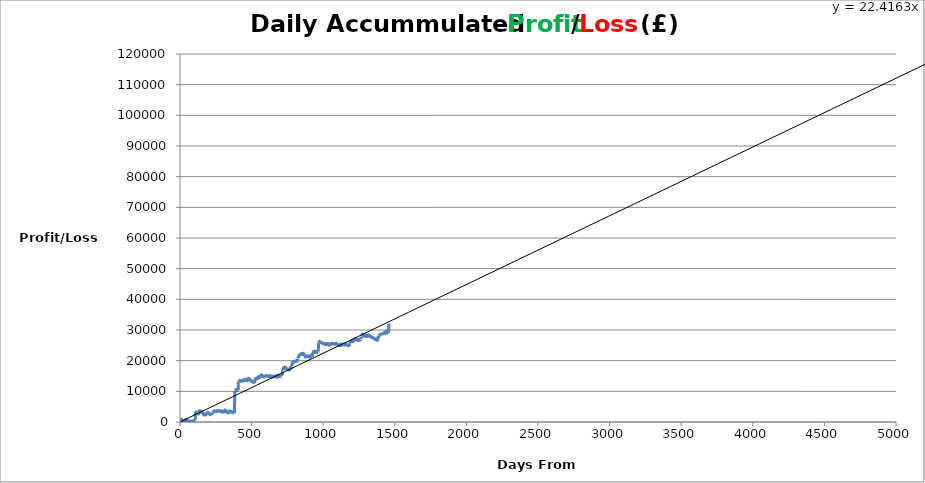
| Category | Accummulated Profit/Loss |
|---|---|
| 1.0 | 79.7 |
| 2.0 | 44 |
| 3.0 | 218.57 |
| 4.0 | 615.34 |
| 5.0 | 641.64 |
| 6.0 | 640.14 |
| 7.0 | 748.59 |
| 8.0 | 823.13 |
| 9.0 | 803.13 |
| 10.0 | 739.13 |
| 11.0 | 869.6 |
| 12.0 | 809.6 |
| 13.0 | 751.6 |
| 14.0 | 751.6 |
| 15.0 | 677.75 |
| 16.0 | 654.25 |
| 17.0 | 574.65 |
| 18.0 | 593.95 |
| 19.0 | 508.95 |
| 20.0 | 441.45 |
| 21.0 | 381.45 |
| 22.0 | 507.23 |
| 23.0 | 426.33 |
| 24.0 | 373.08 |
| 25.0 | 282.06 |
| 26.0 | 180.56 |
| 27.0 | 113.81 |
| 28.0 | 82.89 |
| 29.0 | 473.4 |
| 30.0 | 471.48 |
| 31.0 | 375.08 |
| 32.0 | 453.51 |
| 33.0 | 365.14 |
| 34.0 | 364.51 |
| 35.0 | 306.51 |
| 36.0 | 602.96 |
| 37.0 | 529.11 |
| 38.0 | 439.81 |
| 39.0 | 470.66 |
| 40.0 | 798.36 |
| 41.0 | 817.66 |
| 42.0 | 790.66 |
| 43.0 | 732.66 |
| 44.0 | 703.54 |
| 45.0 | 603.79 |
| 46.0 | 626.46 |
| 47.0 | 710.29 |
| 48.0 | 589.42 |
| 49.0 | 514.1 |
| 50.0 | 597.24 |
| 51.0 | 529.34 |
| 52.0 | 439.47 |
| 53.0 | 454.46 |
| 54.0 | 381.46 |
| 55.0 | 338.28 |
| 56.0 | 298.28 |
| 57.0 | 220.28 |
| 58.0 | 119.06 |
| 59.0 | 559.87 |
| 60.0 | 507.87 |
| 61.0 | 475.35 |
| 62.0 | 436.92 |
| 63.0 | 333.36 |
| 64.0 | 289.36 |
| 65.0 | 245.36 |
| 66.0 | 274.52 |
| 67.0 | 201.52 |
| 68.0 | 240.51 |
| 69.0 | 129.51 |
| 70.0 | 119.51 |
| 71.0 | 119.51 |
| 72.0 | 49.51 |
| 73.0 | 154.59 |
| 74.0 | 128.27 |
| 75.0 | 70.27 |
| 76.0 | -61.23 |
| 77.0 | -36.23 |
| 78.0 | -102.69 |
| 79.0 | 22.27 |
| 80.0 | 112.71 |
| 81.0 | 75.53 |
| 82.0 | 205.55 |
| 83.0 | 219.53 |
| 84.0 | 315.59 |
| 85.0 | 383.97 |
| 86.0 | 383.97 |
| 87.0 | 303.98 |
| 88.0 | 219.38 |
| 89.0 | 169.38 |
| 90.0 | 98.07 |
| 91.0 | 192.07 |
| 92.0 | 156.45 |
| 93.0 | 89.25 |
| 94.0 | -40.72 |
| 95.0 | -92.38 |
| 96.0 | -203.25 |
| 97.0 | -170.45 |
| 98.0 | -167.2 |
| 99.0 | 546.19 |
| 100.0 | 492.39 |
| 101.0 | 539.59 |
| 102.0 | 498.86 |
| 103.0 | 527.36 |
| 104.0 | 576.36 |
| 105.0 | 618.76 |
| 106.0 | 613.45 |
| 107.0 | 3361.83 |
| 108.0 | 3243.48 |
| 109.0 | 3286.38 |
| 110.0 | 3184.88 |
| 111.0 | 3119.58 |
| 112.0 | 3128.21 |
| 113.0 | 3201.34 |
| 114.0 | 3122.84 |
| 115.0 | 3172.71 |
| 116.0 | 3167.71 |
| 117.0 | 3054.2 |
| 118.0 | 2974.2 |
| 119.0 | 2906.8 |
| 120.0 | 2917.7 |
| 121.0 | 2857.7 |
| 122.0 | 2819.9 |
| 123.0 | 2746.4 |
| 124.0 | 2794.06 |
| 125.0 | 2708.65 |
| 126.0 | 2698.65 |
| 127.0 | 2736.67 |
| 128.0 | 2683.67 |
| 129.0 | 2604.29 |
| 130.0 | 2853.79 |
| 131.0 | 2825.79 |
| 132.0 | 2865.54 |
| 133.0 | 2892.6 |
| 134.0 | 3435.61 |
| 135.0 | 3559.16 |
| 136.0 | 3712.52 |
| 137.0 | 3696.77 |
| 138.0 | 3652.04 |
| 139.0 | 3491.04 |
| 140.0 | 3451.04 |
| 141.0 | 3560.04 |
| 142.0 | 3580.79 |
| 143.0 | 3559.72 |
| 144.0 | 3654.22 |
| 145.0 | 3604.37 |
| 146.0 | 3598.87 |
| 147.0 | 3518.87 |
| 148.0 | 3465.51 |
| 149.0 | 3455.51 |
| 150.0 | 3466.51 |
| 151.0 | 3437.16 |
| 152.0 | 3317.88 |
| 153.0 | 3176.88 |
| 154.0 | 3118.88 |
| 155.0 | 3085.43 |
| 156.0 | 2976.53 |
| 157.0 | 2969.47 |
| 158.0 | 2840.69 |
| 159.0 | 2763.3 |
| 160.0 | 2662.93 |
| 161.0 | 2602.93 |
| 162.0 | 2561.83 |
| 163.0 | 2557.67 |
| 164.0 | 2458.23 |
| 165.0 | 2326.73 |
| 166.0 | 2561.98 |
| 167.0 | 2490.98 |
| 168.0 | 2567 |
| 169.0 | 2509.26 |
| 170.0 | 2408.56 |
| 171.0 | 2287.81 |
| 172.0 | 2291.91 |
| 173.0 | 2314.31 |
| 174.0 | 2273.7 |
| 175.0 | 2263.33 |
| 176.0 | 2401.33 |
| 177.0 | 2292.12 |
| 178.0 | 2314.26 |
| 179.0 | 2304.26 |
| 180.0 | 2358.78 |
| 181.0 | 2411.01 |
| 182.0 | 2391.01 |
| 183.0 | 2569.29 |
| 184.0 | 3110.33 |
| 185.0 | 3102.33 |
| 186.0 | 3012.31 |
| 187.0 | 2912.51 |
| 188.0 | 2833.51 |
| 189.0 | 2823.51 |
| 190.0 | 2813.51 |
| 191.0 | 2786.45 |
| 192.0 | 2842.85 |
| 193.0 | 3224.61 |
| 194.0 | 3138.67 |
| 195.0 | 2987.17 |
| 196.0 | 2929.17 |
| 197.0 | 2837.67 |
| 198.0 | 2963.67 |
| 199.0 | 2960.14 |
| 200.0 | 2931.65 |
| 201.0 | 2821.28 |
| 202.0 | 2819.78 |
| 203.0 | 2767.78 |
| 204.0 | 2717.78 |
| 205.0 | 2674.45 |
| 206.0 | 2563.45 |
| 207.0 | 2577.21 |
| 208.0 | 2500.49 |
| 209.0 | 2414.49 |
| 210.0 | 2364.49 |
| 211.0 | 2314.49 |
| 212.0 | 2525.51 |
| 213.0 | 2575.81 |
| 214.0 | 2579.88 |
| 215.0 | 2513.58 |
| 216.0 | 2457.08 |
| 217.0 | 2399.08 |
| 218.0 | 2349.08 |
| 219.0 | 2354.71 |
| 220.0 | 2292.21 |
| 221.0 | 2253.21 |
| 222.0 | 3047.4 |
| 223.0 | 3082.9 |
| 224.0 | 3029.4 |
| 225.0 | 2943.66 |
| 226.0 | 2993.11 |
| 227.0 | 2939.11 |
| 228.0 | 3158.36 |
| 229.0 | 3148.36 |
| 230.0 | 3066.17 |
| 231.0 | 3066.17 |
| 232.0 | 3213.77 |
| 233.0 | 3335.3 |
| 234.0 | 3257.3 |
| 235.0 | 3455.3 |
| 236.0 | 3428.8 |
| 237.0 | 3615.2 |
| 238.0 | 3605.2 |
| 239.0 | 3543.95 |
| 240.0 | 3631.83 |
| 241.0 | 3640.83 |
| 242.0 | 3684.33 |
| 243.0 | 3621.33 |
| 244.0 | 3563.33 |
| 245.0 | 3543.33 |
| 246.0 | 3425.33 |
| 247.0 | 3415.33 |
| 248.0 | 3347.33 |
| 249.0 | 3406.03 |
| 250.0 | 3464.73 |
| 251.0 | 3334.16 |
| 252.0 | 3502.16 |
| 253.0 | 3492.16 |
| 254.0 | 4005.66 |
| 255.0 | 3975.38 |
| 256.0 | 3930.38 |
| 257.0 | 3819.41 |
| 258.0 | 3809.41 |
| 259.0 | 3829.41 |
| 260.0 | 3728.54 |
| 261.0 | 3663.04 |
| 262.0 | 3663.04 |
| 263.0 | 3663.04 |
| 264.0 | 3663.04 |
| 265.0 | 3611.84 |
| 266.0 | 3700.84 |
| 267.0 | 3642.84 |
| 268.0 | 3547.64 |
| 269.0 | 3545.85 |
| 270.0 | 3490.45 |
| 271.0 | 3623.24 |
| 272.0 | 3613.24 |
| 273.0 | 3582.04 |
| 274.0 | 3598.92 |
| 275.0 | 3588.92 |
| 276.0 | 3561.77 |
| 277.0 | 3618.35 |
| 278.0 | 3719.09 |
| 279.0 | 3639.14 |
| 280.0 | 3586.14 |
| 281.0 | 3536.14 |
| 282.0 | 3486.14 |
| 283.0 | 3624.14 |
| 284.0 | 3519.12 |
| 285.0 | 3439.37 |
| 286.0 | 3369.37 |
| 287.0 | 3369.37 |
| 288.0 | 3311.37 |
| 289.0 | 3258.57 |
| 290.0 | 3364.76 |
| 291.0 | 3445.06 |
| 292.0 | 3349.06 |
| 293.0 | 3342.85 |
| 294.0 | 3573.95 |
| 295.0 | 3515.95 |
| 296.0 | 3462.95 |
| 297.0 | 3452.95 |
| 298.0 | 3402.95 |
| 299.0 | 3292.3 |
| 300.0 | 3344.35 |
| 301.0 | 3334.35 |
| 302.0 | 3246.18 |
| 303.0 | 3279.02 |
| 304.0 | 3283.82 |
| 305.0 | 3321.65 |
| 306.0 | 3260.82 |
| 307.0 | 3305.52 |
| 308.0 | 3285.52 |
| 309.0 | 3294.75 |
| 310.0 | 3319 |
| 311.0 | 3619 |
| 312.0 | 3727.6 |
| 313.0 | 3688.6 |
| 314.0 | 3933.48 |
| 315.0 | 3923.48 |
| 316.0 | 3913.48 |
| 317.0 | 3862.92 |
| 318.0 | 3785.67 |
| 319.0 | 3727.67 |
| 320.0 | 3677.67 |
| 321.0 | 3602.29 |
| 322.0 | 3582.29 |
| 323.0 | 3538.29 |
| 324.0 | 3528.29 |
| 325.0 | 3478.29 |
| 326.0 | 3360.84 |
| 327.0 | 3294.29 |
| 328.0 | 3234.29 |
| 329.0 | 3208.29 |
| 330.0 | 3168.29 |
| 331.0 | 3168.29 |
| 332.0 | 3177.14 |
| 333.0 | 3065.64 |
| 334.0 | 3015.64 |
| 335.0 | 3006.74 |
| 336.0 | 3115.74 |
| 337.0 | 3105.74 |
| 338.0 | 3055.74 |
| 339.0 | 3005.74 |
| 340.0 | 3046.94 |
| 341.0 | 3002.94 |
| 342.0 | 3072.94 |
| 343.0 | 3072.94 |
| 344.0 | 3090.71 |
| 345.0 | 3239.78 |
| 346.0 | 3631.71 |
| 347.0 | 3615.73 |
| 348.0 | 3542.63 |
| 349.0 | 3531.07 |
| 350.0 | 3478.27 |
| 351.0 | 3428.27 |
| 352.0 | 3418.27 |
| 353.0 | 3370.27 |
| 354.0 | 3303.5 |
| 355.0 | 3475.18 |
| 356.0 | 3477.56 |
| 357.0 | 3496.16 |
| 358.0 | 3470.16 |
| 359.0 | 3417.76 |
| 360.0 | 3375.91 |
| 361.0 | 3303.94 |
| 362.0 | 3251.34 |
| 363.0 | 3171.49 |
| 364.0 | 3127.49 |
| 365.0 | 3252.89 |
| 366.0 | 3212.89 |
| 367.0 | 3172.89 |
| 368.0 | 3176.89 |
| 369.0 | 3109.08 |
| 370.0 | 3078.58 |
| 371.0 | 3071.11 |
| 372.0 | 3049.11 |
| 373.0 | 3049.11 |
| 374.0 | 2948.11 |
| 375.0 | 3016.85 |
| 376.0 | 2977.85 |
| 377.0 | 2958.14 |
| 378.0 | 2948.14 |
| 379.0 | 3008.94 |
| 380.0 | 2922.66 |
| 381.0 | 2922 |
| 382.0 | 10166.56 |
| 383.0 | 10103.96 |
| 384.0 | 10002.96 |
| 385.0 | 9944.96 |
| 386.0 | 10015.74 |
| 387.0 | 9999.92 |
| 388.0 | 10267.26 |
| 389.0 | 10505.86 |
| 390.0 | 10554.66 |
| 391.0 | 10556.12 |
| 392.0 | 10505.75 |
| 393.0 | 10457.5 |
| 394.0 | 10366.5 |
| 395.0 | 10669 |
| 396.0 | 10601.4 |
| 397.0 | 10520.68 |
| 398.0 | 10364.45 |
| 399.0 | 10364.45 |
| 400.0 | 10280.73 |
| 401.0 | 10276.73 |
| 402.0 | 10397.48 |
| 403.0 | 10642.62 |
| 404.0 | 10541.62 |
| 405.0 | 10442.18 |
| 406.0 | 10432.18 |
| 407.0 | 12315.01 |
| 408.0 | 13232.01 |
| 409.0 | 13342.01 |
| 410.0 | 13355.71 |
| 411.0 | 13368.32 |
| 412.0 | 13481.2 |
| 413.0 | 13471.2 |
| 414.0 | 13504.3 |
| 415.0 | 13481.9 |
| 416.0 | 13431.9 |
| 417.0 | 13431.9 |
| 418.0 | 13570.7 |
| 419.0 | 13479.75 |
| 420.0 | 13520.21 |
| 421.0 | 13516.51 |
| 422.0 | 13426.76 |
| 423.0 | 13448.14 |
| 424.0 | 13347.17 |
| 425.0 | 13340.67 |
| 426.0 | 13326.42 |
| 427.0 | 13316.42 |
| 428.0 | 13307.47 |
| 429.0 | 13239.47 |
| 430.0 | 13367.47 |
| 431.0 | 13479.87 |
| 432.0 | 13511.61 |
| 433.0 | 13518.41 |
| 434.0 | 13518.41 |
| 435.0 | 13463.51 |
| 436.0 | 13353.61 |
| 437.0 | 13306.66 |
| 438.0 | 13431.56 |
| 439.0 | 13364.97 |
| 440.0 | 13441.37 |
| 441.0 | 13592.27 |
| 442.0 | 13651.37 |
| 443.0 | 13658.12 |
| 444.0 | 13718.8 |
| 445.0 | 13682.6 |
| 446.0 | 13692.96 |
| 447.0 | 13622.11 |
| 448.0 | 13566.61 |
| 449.0 | 13457.56 |
| 450.0 | 13457.8 |
| 451.0 | 13853.64 |
| 452.0 | 13947.87 |
| 453.0 | 13885.55 |
| 454.0 | 13765.79 |
| 455.0 | 13845.79 |
| 456.0 | 13787.79 |
| 457.0 | 13874.21 |
| 458.0 | 13813.78 |
| 459.0 | 13763.78 |
| 460.0 | 13817.43 |
| 461.0 | 13772.04 |
| 462.0 | 13721.6 |
| 463.0 | 13651.6 |
| 464.0 | 13593.14 |
| 465.0 | 13523.14 |
| 466.0 | 13436.5 |
| 467.0 | 13497.68 |
| 468.0 | 13424.04 |
| 469.0 | 13488.54 |
| 470.0 | 13590.64 |
| 471.0 | 13534.24 |
| 472.0 | 13544.44 |
| 473.0 | 13720.08 |
| 474.0 | 13693.34 |
| 475.0 | 14029.74 |
| 476.0 | 14096.56 |
| 477.0 | 14212.11 |
| 478.0 | 14142.49 |
| 479.0 | 14248.53 |
| 480.0 | 14242.8 |
| 481.0 | 14285.2 |
| 482.0 | 14173.7 |
| 483.0 | 14123.7 |
| 484.0 | 14002.2 |
| 485.0 | 13921.2 |
| 486.0 | 13790.75 |
| 487.0 | 13736.75 |
| 488.0 | 13756.15 |
| 489.0 | 13660.15 |
| 490.0 | 13628.15 |
| 491.0 | 13726.15 |
| 492.0 | 13676.15 |
| 493.0 | 13574.65 |
| 494.0 | 13487.15 |
| 495.0 | 13434.61 |
| 496.0 | 13366.91 |
| 497.0 | 13315.26 |
| 498.0 | 13305.26 |
| 499.0 | 13357.01 |
| 500.0 | 13275.85 |
| 501.0 | 13411.85 |
| 502.0 | 13409.76 |
| 503.0 | 13288.78 |
| 504.0 | 13228.78 |
| 505.0 | 13138.91 |
| 506.0 | 13107.02 |
| 507.0 | 13081.02 |
| 508.0 | 13037.02 |
| 509.0 | 12906.02 |
| 510.0 | 13041.94 |
| 511.0 | 13003.26 |
| 512.0 | 13182.85 |
| 513.0 | 13129.35 |
| 514.0 | 13015.7 |
| 515.0 | 12945.7 |
| 516.0 | 12975.7 |
| 517.0 | 12957.1 |
| 518.0 | 12897.1 |
| 519.0 | 13122.68 |
| 520.0 | 13072.68 |
| 521.0 | 13173.46 |
| 522.0 | 13197.6 |
| 523.0 | 13196.03 |
| 524.0 | 13234.6 |
| 525.0 | 13792.74 |
| 526.0 | 14051.93 |
| 527.0 | 14099.73 |
| 528.0 | 14155.13 |
| 529.0 | 14156.83 |
| 530.0 | 14126.33 |
| 531.0 | 14225.44 |
| 532.0 | 14194.94 |
| 533.0 | 14148.46 |
| 534.0 | 14071.69 |
| 535.0 | 14226.79 |
| 536.0 | 14165.29 |
| 537.0 | 14064.32 |
| 538.0 | 14145.52 |
| 539.0 | 14226.64 |
| 540.0 | 14263.53 |
| 541.0 | 14236.28 |
| 542.0 | 14269.7 |
| 543.0 | 14176.24 |
| 544.0 | 14284.35 |
| 545.0 | 14718.86 |
| 546.0 | 14653.86 |
| 547.0 | 14578.86 |
| 548.0 | 14532.11 |
| 549.0 | 14462.11 |
| 550.0 | 14529.36 |
| 551.0 | 14606.55 |
| 552.0 | 14470.2 |
| 553.0 | 14420.2 |
| 554.0 | 14686.52 |
| 555.0 | 14811.55 |
| 556.0 | 14843.6 |
| 557.0 | 14750.6 |
| 558.0 | 14797.85 |
| 559.0 | 14947.85 |
| 560.0 | 14947.85 |
| 561.0 | 14879.98 |
| 562.0 | 15115.98 |
| 563.0 | 15153.26 |
| 564.0 | 15250.14 |
| 565.0 | 15154.19 |
| 566.0 | 15385.44 |
| 567.0 | 15370.44 |
| 568.0 | 15320.44 |
| 569.0 | 15392.74 |
| 570.0 | 15342.5 |
| 571.0 | 15212.5 |
| 572.0 | 15164.41 |
| 573.0 | 15111.66 |
| 574.0 | 15061.66 |
| 575.0 | 15035.66 |
| 576.0 | 15035.66 |
| 577.0 | 15035.66 |
| 578.0 | 15035.66 |
| 579.0 | 14969.41 |
| 580.0 | 14879.41 |
| 581.0 | 14829.81 |
| 582.0 | 14860.21 |
| 583.0 | 14850.21 |
| 584.0 | 14770.21 |
| 585.0 | 14716.41 |
| 586.0 | 14927.23 |
| 587.0 | 14784.57 |
| 588.0 | 14706.57 |
| 589.0 | 14638.7 |
| 590.0 | 14686.02 |
| 591.0 | 14622.52 |
| 592.0 | 14636.02 |
| 593.0 | 15275.05 |
| 594.0 | 15223.35 |
| 595.0 | 15222.85 |
| 596.0 | 15164.85 |
| 597.0 | 15164.85 |
| 598.0 | 15094.85 |
| 599.0 | 15044.85 |
| 600.0 | 15044.08 |
| 601.0 | 14991.08 |
| 602.0 | 14991.08 |
| 603.0 | 15071.08 |
| 604.0 | 15021.08 |
| 605.0 | 14962.08 |
| 606.0 | 14977.08 |
| 607.0 | 14933.08 |
| 608.0 | 15076.07 |
| 609.0 | 15066.07 |
| 610.0 | 15057.78 |
| 611.0 | 15007.78 |
| 612.0 | 15141.8 |
| 613.0 | 15061.8 |
| 614.0 | 15075.24 |
| 615.0 | 15016.69 |
| 616.0 | 15016.69 |
| 617.0 | 14956.69 |
| 618.0 | 14898.69 |
| 619.0 | 14915.99 |
| 620.0 | 14830.99 |
| 621.0 | 14936.05 |
| 622.0 | 14948.88 |
| 623.0 | 14988.48 |
| 624.0 | 14886.98 |
| 625.0 | 14836.98 |
| 626.0 | 14926.68 |
| 627.0 | 14846.93 |
| 628.0 | 14846.93 |
| 629.0 | 14846.93 |
| 630.0 | 14846.93 |
| 631.0 | 14826.43 |
| 632.0 | 15031.83 |
| 633.0 | 15005.83 |
| 634.0 | 15110.83 |
| 635.0 | 15010.18 |
| 636.0 | 14929.18 |
| 637.0 | 14986.15 |
| 638.0 | 14928.75 |
| 639.0 | 14868.75 |
| 640.0 | 14728.13 |
| 641.0 | 14919.88 |
| 642.0 | 14859.61 |
| 643.0 | 14826.24 |
| 644.0 | 14776.24 |
| 645.0 | 14706.24 |
| 646.0 | 14691.19 |
| 647.0 | 14705.19 |
| 648.0 | 14677.19 |
| 649.0 | 14780.63 |
| 650.0 | 14751.02 |
| 651.0 | 14751.02 |
| 652.0 | 14831.02 |
| 653.0 | 14730 |
| 654.0 | 14933.07 |
| 655.0 | 14992.44 |
| 656.0 | 14973.65 |
| 657.0 | 14883.65 |
| 658.0 | 14883.65 |
| 659.0 | 14933.65 |
| 660.0 | 14883.65 |
| 661.0 | 14835.65 |
| 662.0 | 14764.65 |
| 663.0 | 14748.47 |
| 664.0 | 14737.47 |
| 665.0 | 14834.32 |
| 666.0 | 14790.32 |
| 667.0 | 14712.32 |
| 668.0 | 14776.3 |
| 669.0 | 14965.1 |
| 670.0 | 14892.4 |
| 671.0 | 15032.94 |
| 672.0 | 14964.94 |
| 673.0 | 14873.93 |
| 674.0 | 14796.19 |
| 675.0 | 14725.39 |
| 676.0 | 14769.39 |
| 677.0 | 14749.39 |
| 678.0 | 14617.89 |
| 679.0 | 14567.89 |
| 680.0 | 14793.69 |
| 681.0 | 14735.69 |
| 682.0 | 14667.69 |
| 683.0 | 14834.99 |
| 684.0 | 14781.92 |
| 685.0 | 15248.92 |
| 686.0 | 15208.92 |
| 687.0 | 15158.92 |
| 688.0 | 15108.92 |
| 689.0 | 15018.05 |
| 690.0 | 14964.05 |
| 691.0 | 14954.68 |
| 692.0 | 14856.87 |
| 693.0 | 14834.47 |
| 694.0 | 15002.47 |
| 695.0 | 14952.47 |
| 696.0 | 14961.57 |
| 697.0 | 14916.57 |
| 698.0 | 14961.77 |
| 699.0 | 14911.77 |
| 700.0 | 14861.77 |
| 701.0 | 14853.45 |
| 702.0 | 14910.99 |
| 703.0 | 14907.68 |
| 704.0 | 15256.83 |
| 705.0 | 15198.83 |
| 706.0 | 15108.83 |
| 707.0 | 15108.83 |
| 708.0 | 15050.14 |
| 709.0 | 15545.99 |
| 710.0 | 15590.59 |
| 711.0 | 15603.59 |
| 712.0 | 15536.09 |
| 713.0 | 15544.32 |
| 714.0 | 15490.32 |
| 715.0 | 15829.42 |
| 716.0 | 16557.57 |
| 717.0 | 16797.69 |
| 718.0 | 16902.49 |
| 719.0 | 16900.49 |
| 720.0 | 16903.59 |
| 721.0 | 16893.59 |
| 722.0 | 16853.59 |
| 723.0 | 18189.47 |
| 724.0 | 18162.17 |
| 725.0 | 18127.17 |
| 726.0 | 18125.42 |
| 727.0 | 17983.92 |
| 728.0 | 17973.92 |
| 729.0 | 17963.92 |
| 730.0 | 17963.92 |
| 731.0 | 17865.77 |
| 732.0 | 17838.48 |
| 733.0 | 17861.73 |
| 734.0 | 17832.53 |
| 735.0 | 17782.53 |
| 736.0 | 17707.83 |
| 737.0 | 17767.39 |
| 738.0 | 17693.64 |
| 739.0 | 17643.64 |
| 740.0 | 17580.64 |
| 741.0 | 17500.94 |
| 742.0 | 17500.94 |
| 743.0 | 17449.44 |
| 744.0 | 17358.44 |
| 745.0 | 17338.76 |
| 746.0 | 17373.76 |
| 747.0 | 17332.58 |
| 748.0 | 17181.08 |
| 749.0 | 17181.08 |
| 750.0 | 17117.08 |
| 751.0 | 17259.28 |
| 752.0 | 17251.08 |
| 753.0 | 17231.08 |
| 754.0 | 17173.83 |
| 755.0 | 17098.03 |
| 756.0 | 17040.03 |
| 757.0 | 16962.41 |
| 758.0 | 16939.34 |
| 759.0 | 16935.08 |
| 760.0 | 16988.4 |
| 761.0 | 16898.6 |
| 762.0 | 16906.48 |
| 763.0 | 17060.11 |
| 764.0 | 17206.79 |
| 765.0 | 17154.79 |
| 766.0 | 17146.04 |
| 767.0 | 17141.04 |
| 768.0 | 17100.04 |
| 769.0 | 17474.16 |
| 770.0 | 17434.16 |
| 771.0 | 17434.16 |
| 772.0 | 17366.56 |
| 773.0 | 17266.56 |
| 774.0 | 17568.57 |
| 775.0 | 17492.57 |
| 776.0 | 18153.47 |
| 777.0 | 18095.47 |
| 778.0 | 18127.21 |
| 779.0 | 17998.46 |
| 780.0 | 18024.84 |
| 781.0 | 18363.52 |
| 782.0 | 18353.52 |
| 783.0 | 18288.9 |
| 784.0 | 19441.4 |
| 785.0 | 19629.94 |
| 786.0 | 19674.63 |
| 787.0 | 19573.63 |
| 788.0 | 19526.83 |
| 789.0 | 19629.59 |
| 790.0 | 19555.44 |
| 791.0 | 19555.44 |
| 792.0 | 19454.44 |
| 793.0 | 19400.44 |
| 794.0 | 19572.94 |
| 795.0 | 19497.94 |
| 796.0 | 19604.48 |
| 797.0 | 19615.11 |
| 798.0 | 19562.31 |
| 799.0 | 19512.31 |
| 800.0 | 19720.23 |
| 801.0 | 19830.73 |
| 802.0 | 19772.73 |
| 803.0 | 19794.7 |
| 804.0 | 19825.4 |
| 805.0 | 19815.4 |
| 806.0 | 19855.4 |
| 807.0 | 19799.35 |
| 808.0 | 19760.58 |
| 809.0 | 19776.58 |
| 810.0 | 19842.14 |
| 811.0 | 19794.44 |
| 812.0 | 19889.74 |
| 813.0 | 19967.34 |
| 814.0 | 19951.35 |
| 815.0 | 19860.35 |
| 816.0 | 19721.79 |
| 817.0 | 19677.39 |
| 818.0 | 19710.19 |
| 819.0 | 20569.87 |
| 820.0 | 20613.53 |
| 821.0 | 20512.53 |
| 822.0 | 20595.97 |
| 823.0 | 20492.58 |
| 824.0 | 20725.55 |
| 825.0 | 20839.83 |
| 826.0 | 20762.08 |
| 827.0 | 21244.18 |
| 828.0 | 21460.21 |
| 829.0 | 21392.41 |
| 830.0 | 21282.54 |
| 831.0 | 21220.45 |
| 832.0 | 21716.41 |
| 833.0 | 21649.41 |
| 834.0 | 21860.94 |
| 835.0 | 21863.44 |
| 836.0 | 21890.07 |
| 837.0 | 21810.07 |
| 838.0 | 22000.14 |
| 839.0 | 22031.32 |
| 840.0 | 21981.32 |
| 841.0 | 21960.65 |
| 842.0 | 22133.65 |
| 843.0 | 22089.65 |
| 844.0 | 22191.12 |
| 845.0 | 22233.92 |
| 846.0 | 22280.92 |
| 847.0 | 22240.92 |
| 848.0 | 22129.95 |
| 849.0 | 22121.95 |
| 850.0 | 22119.72 |
| 851.0 | 22175.14 |
| 852.0 | 22058.64 |
| 853.0 | 22041.49 |
| 854.0 | 22031.49 |
| 855.0 | 21987.07 |
| 856.0 | 22255.83 |
| 857.0 | 22181.83 |
| 858.0 | 22296.95 |
| 859.0 | 22415.46 |
| 860.0 | 22379.67 |
| 861.0 | 22369.67 |
| 862.0 | 22292.27 |
| 863.0 | 22250.77 |
| 864.0 | 22247.52 |
| 865.0 | 22144.72 |
| 866.0 | 22025.92 |
| 867.0 | 21889.42 |
| 868.0 | 21831.42 |
| 869.0 | 21757.15 |
| 870.0 | 21671.05 |
| 871.0 | 21603.3 |
| 872.0 | 21506.8 |
| 873.0 | 21396.05 |
| 874.0 | 21269.3 |
| 875.0 | 21229.3 |
| 876.0 | 21315.86 |
| 877.0 | 21304.3 |
| 878.0 | 21332.93 |
| 879.0 | 21241.93 |
| 880.0 | 21414.93 |
| 881.0 | 21373.18 |
| 882.0 | 21410.5 |
| 883.0 | 21452.69 |
| 884.0 | 21402.69 |
| 885.0 | 21352.69 |
| 886.0 | 21379.29 |
| 887.0 | 21444.93 |
| 888.0 | 21604.49 |
| 889.0 | 21534.49 |
| 890.0 | 21482.49 |
| 891.0 | 21502.74 |
| 892.0 | 21473.84 |
| 893.0 | 21434.84 |
| 894.0 | 21469.07 |
| 895.0 | 21379.2 |
| 896.0 | 21412.64 |
| 897.0 | 21354.64 |
| 898.0 | 21265.39 |
| 899.0 | 21184.39 |
| 900.0 | 21399.99 |
| 901.0 | 21393.59 |
| 902.0 | 21285.1 |
| 903.0 | 21341.1 |
| 904.0 | 21297.35 |
| 905.0 | 21283.68 |
| 906.0 | 21306.32 |
| 907.0 | 21373.56 |
| 908.0 | 21284.74 |
| 909.0 | 21128.24 |
| 910.0 | 21262.08 |
| 911.0 | 21331.14 |
| 912.0 | 21675.64 |
| 913.0 | 21658.53 |
| 914.0 | 21683.83 |
| 915.0 | 21691.08 |
| 916.0 | 21798.38 |
| 917.0 | 21718.33 |
| 918.0 | 21597.36 |
| 919.0 | 21508.05 |
| 920.0 | 21536.55 |
| 921.0 | 21563.28 |
| 922.0 | 21691.78 |
| 923.0 | 21696.93 |
| 924.0 | 21644.76 |
| 925.0 | 21632.89 |
| 926.0 | 22111.09 |
| 927.0 | 22242.09 |
| 928.0 | 22473.19 |
| 929.0 | 22414.39 |
| 930.0 | 22862.46 |
| 931.0 | 22829.06 |
| 932.0 | 23317.31 |
| 933.0 | 23252.61 |
| 934.0 | 23185.41 |
| 935.0 | 23226.23 |
| 936.0 | 23184.49 |
| 937.0 | 23077.99 |
| 938.0 | 23017.99 |
| 939.0 | 23068.07 |
| 940.0 | 22969.62 |
| 941.0 | 22946.12 |
| 942.0 | 22940.02 |
| 943.0 | 22874.46 |
| 944.0 | 22773.46 |
| 945.0 | 22763.46 |
| 946.0 | 22982.6 |
| 947.0 | 22932.6 |
| 948.0 | 23049.29 |
| 949.0 | 23056.09 |
| 950.0 | 22998.42 |
| 951.0 | 22900.09 |
| 952.0 | 22850.09 |
| 953.0 | 22890.49 |
| 954.0 | 22859.29 |
| 955.0 | 22775.23 |
| 956.0 | 22769.11 |
| 957.0 | 22665.66 |
| 958.0 | 22824.77 |
| 959.0 | 22784.63 |
| 960.0 | 22839.83 |
| 961.0 | 22787.83 |
| 962.0 | 22797.83 |
| 963.0 | 22811.96 |
| 964.0 | 23076.9 |
| 965.0 | 22976.22 |
| 966.0 | 22976.22 |
| 967.0 | 25687.02 |
| 968.0 | 25777.57 |
| 969.0 | 25920.72 |
| 970.0 | 26044.88 |
| 971.0 | 26142.48 |
| 972.0 | 26074.48 |
| 973.0 | 26064.48 |
| 974.0 | 26323.33 |
| 975.0 | 26255.33 |
| 976.0 | 26195.71 |
| 977.0 | 26155.71 |
| 978.0 | 26101.51 |
| 979.0 | 25981.42 |
| 980.0 | 25981.42 |
| 981.0 | 26001.42 |
| 982.0 | 25950.76 |
| 983.0 | 25890.76 |
| 984.0 | 26012.76 |
| 985.0 | 25967.76 |
| 986.0 | 25948.39 |
| 987.0 | 25958.79 |
| 988.0 | 25898.79 |
| 989.0 | 25880.79 |
| 990.0 | 25876.87 |
| 991.0 | 25852.49 |
| 992.0 | 25761.49 |
| 993.0 | 25713.62 |
| 994.0 | 25713.62 |
| 995.0 | 25713.62 |
| 996.0 | 25635.16 |
| 997.0 | 25567.29 |
| 998.0 | 25534.49 |
| 999.0 | 25534.49 |
| 1000.0 | 25665.66 |
| 1001.0 | 25713.81 |
| 1002.0 | 25636.79 |
| 1003.0 | 25578.79 |
| 1004.0 | 25492.94 |
| 1005.0 | 25461.64 |
| 1006.0 | 25431.84 |
| 1007.0 | 25520.14 |
| 1008.0 | 25460.14 |
| 1009.0 | 25532.94 |
| 1010.0 | 25472.94 |
| 1011.0 | 25404.93 |
| 1012.0 | 25346.93 |
| 1013.0 | 25381.89 |
| 1014.0 | 25356.44 |
| 1015.0 | 25296.44 |
| 1016.0 | 25426.28 |
| 1017.0 | 25368.28 |
| 1018.0 | 25298.28 |
| 1019.0 | 25324.82 |
| 1020.0 | 25231.58 |
| 1021.0 | 25181.58 |
| 1022.0 | 25225.14 |
| 1023.0 | 25561.91 |
| 1024.0 | 25611.91 |
| 1025.0 | 25680.86 |
| 1026.0 | 25633.88 |
| 1027.0 | 25640.28 |
| 1028.0 | 25572.28 |
| 1029.0 | 25572.28 |
| 1030.0 | 25518.28 |
| 1031.0 | 25448.28 |
| 1032.0 | 25370.68 |
| 1033.0 | 25334.28 |
| 1034.0 | 25315.96 |
| 1035.0 | 25238.31 |
| 1036.0 | 25228.31 |
| 1037.0 | 25178.31 |
| 1038.0 | 25143.51 |
| 1039.0 | 25090.39 |
| 1040.0 | 25524.03 |
| 1041.0 | 25534.03 |
| 1042.0 | 25449.41 |
| 1043.0 | 25439.41 |
| 1044.0 | 25375.61 |
| 1045.0 | 25365.61 |
| 1046.0 | 25395.96 |
| 1047.0 | 25399.21 |
| 1048.0 | 25392.61 |
| 1049.0 | 25302.8 |
| 1050.0 | 25249.8 |
| 1051.0 | 25244.78 |
| 1052.0 | 25228.76 |
| 1053.0 | 25419.31 |
| 1054.0 | 25387.77 |
| 1055.0 | 25333.77 |
| 1056.0 | 25439.46 |
| 1057.0 | 25628.75 |
| 1058.0 | 25567.35 |
| 1059.0 | 25672.65 |
| 1060.0 | 25672.65 |
| 1061.0 | 25672.65 |
| 1062.0 | 25672.65 |
| 1063.0 | 25691.15 |
| 1064.0 | 25641.15 |
| 1065.0 | 25623.05 |
| 1066.0 | 25559.25 |
| 1067.0 | 25556.6 |
| 1068.0 | 25496.6 |
| 1069.0 | 25535.53 |
| 1070.0 | 25619.6 |
| 1071.0 | 25619.6 |
| 1072.0 | 25619.6 |
| 1073.0 | 25523.29 |
| 1074.0 | 25509.27 |
| 1075.0 | 25526.52 |
| 1076.0 | 25408.02 |
| 1077.0 | 25322.77 |
| 1078.0 | 25322.77 |
| 1079.0 | 25428.77 |
| 1080.0 | 25378.77 |
| 1081.0 | 25317.52 |
| 1082.0 | 25363.58 |
| 1083.0 | 25481.21 |
| 1084.0 | 25435.21 |
| 1085.0 | 25519.6 |
| 1086.0 | 25578.85 |
| 1087.0 | 25520.85 |
| 1088.0 | 25440.75 |
| 1089.0 | 25465.54 |
| 1090.0 | 25674.54 |
| 1091.0 | 25606.54 |
| 1092.0 | 25573.53 |
| 1093.0 | 25547.53 |
| 1094.0 | 25469.91 |
| 1095.0 | 25473.91 |
| 1096.0 | 25423.91 |
| 1097.0 | 25413.91 |
| 1098.0 | 25302.41 |
| 1099.0 | 25309.45 |
| 1100.0 | 25239.19 |
| 1101.0 | 25177.69 |
| 1102.0 | 25099.69 |
| 1103.0 | 25051.19 |
| 1104.0 | 24940.19 |
| 1105.0 | 25199.73 |
| 1106.0 | 25243.23 |
| 1107.0 | 25233.23 |
| 1108.0 | 25224.03 |
| 1109.0 | 25123.38 |
| 1110.0 | 25092.88 |
| 1111.0 | 24981.88 |
| 1112.0 | 25086.88 |
| 1113.0 | 25036.88 |
| 1114.0 | 25017.88 |
| 1115.0 | 24958.08 |
| 1116.0 | 25187.68 |
| 1117.0 | 25056.18 |
| 1118.0 | 24976.37 |
| 1119.0 | 25214.87 |
| 1120.0 | 25204.87 |
| 1121.0 | 25340.26 |
| 1122.0 | 25243.39 |
| 1123.0 | 25183.39 |
| 1124.0 | 25265.08 |
| 1125.0 | 25154.28 |
| 1126.0 | 25027.78 |
| 1127.0 | 24949.78 |
| 1128.0 | 25051.03 |
| 1129.0 | 24987.03 |
| 1130.0 | 25103.06 |
| 1131.0 | 25241.44 |
| 1132.0 | 25445.64 |
| 1133.0 | 25373.16 |
| 1134.0 | 25408.74 |
| 1135.0 | 25375.77 |
| 1136.0 | 25322.52 |
| 1137.0 | 25371.02 |
| 1138.0 | 25443.97 |
| 1139.0 | 25358.87 |
| 1140.0 | 25458.67 |
| 1141.0 | 25438.67 |
| 1142.0 | 25388.67 |
| 1143.0 | 25344.67 |
| 1144.0 | 25288.25 |
| 1145.0 | 25266.25 |
| 1146.0 | 25170.25 |
| 1147.0 | 25119.58 |
| 1148.0 | 25063.51 |
| 1149.0 | 25167.26 |
| 1150.0 | 25486.95 |
| 1151.0 | 25526.95 |
| 1152.0 | 25505.35 |
| 1153.0 | 25484.35 |
| 1154.0 | 25439.35 |
| 1155.0 | 25383.05 |
| 1156.0 | 25465.45 |
| 1157.0 | 25415.45 |
| 1158.0 | 25296.49 |
| 1159.0 | 25239.49 |
| 1160.0 | 25397.31 |
| 1161.0 | 25343.31 |
| 1162.0 | 25333.31 |
| 1163.0 | 25293.31 |
| 1164.0 | 25253.31 |
| 1165.0 | 25284.42 |
| 1166.0 | 25234.42 |
| 1167.0 | 25224.42 |
| 1168.0 | 25161.85 |
| 1169.0 | 25151.85 |
| 1170.0 | 25089.81 |
| 1171.0 | 24951.06 |
| 1172.0 | 24907.26 |
| 1173.0 | 25007.89 |
| 1174.0 | 24949.89 |
| 1175.0 | 24979.31 |
| 1176.0 | 24967.91 |
| 1177.0 | 25002.17 |
| 1178.0 | 24952.17 |
| 1179.0 | 24976.43 |
| 1180.0 | 24886.68 |
| 1181.0 | 24977.16 |
| 1182.0 | 25566.2 |
| 1183.0 | 25498.2 |
| 1184.0 | 25436 |
| 1185.0 | 25604 |
| 1186.0 | 25655.1 |
| 1187.0 | 25655.1 |
| 1188.0 | 25683.2 |
| 1189.0 | 25641.25 |
| 1190.0 | 26309.5 |
| 1191.0 | 26207 |
| 1192.0 | 26120.94 |
| 1193.0 | 26122.1 |
| 1194.0 | 26122.1 |
| 1195.0 | 26118.35 |
| 1196.0 | 26718.3 |
| 1197.0 | 26747.1 |
| 1198.0 | 26716.49 |
| 1199.0 | 26640.6 |
| 1200.0 | 26563.52 |
| 1201.0 | 26510.77 |
| 1202.0 | 26457.11 |
| 1203.0 | 26426.15 |
| 1204.0 | 26562.95 |
| 1205.0 | 26473.05 |
| 1206.0 | 26351.55 |
| 1207.0 | 26281.55 |
| 1208.0 | 26183.41 |
| 1209.0 | 26166.37 |
| 1210.0 | 26511.75 |
| 1211.0 | 26461.75 |
| 1212.0 | 26440.75 |
| 1213.0 | 26502.06 |
| 1214.0 | 26544.19 |
| 1215.0 | 26708.2 |
| 1216.0 | 26770.38 |
| 1217.0 | 26968.48 |
| 1218.0 | 26989.94 |
| 1219.0 | 27099.94 |
| 1220.0 | 27095.74 |
| 1221.0 | 27130.31 |
| 1222.0 | 27112.71 |
| 1223.0 | 27086.91 |
| 1224.0 | 26995.91 |
| 1225.0 | 26985.91 |
| 1226.0 | 27023.91 |
| 1227.0 | 27026.16 |
| 1228.0 | 26884.66 |
| 1229.0 | 26948.16 |
| 1230.0 | 26885.56 |
| 1231.0 | 26816.31 |
| 1232.0 | 27013.91 |
| 1233.0 | 26901.45 |
| 1234.0 | 26834.45 |
| 1235.0 | 26761.03 |
| 1236.0 | 26760.96 |
| 1237.0 | 26641.4 |
| 1238.0 | 26582.75 |
| 1239.0 | 26711.39 |
| 1240.0 | 26661.39 |
| 1241.0 | 26628.59 |
| 1242.0 | 26655.45 |
| 1243.0 | 26866.45 |
| 1244.0 | 26900.2 |
| 1245.0 | 26909.27 |
| 1246.0 | 26859.27 |
| 1247.0 | 26783.35 |
| 1248.0 | 26723.35 |
| 1249.0 | 26632.35 |
| 1250.0 | 26605.89 |
| 1251.0 | 26583.49 |
| 1252.0 | 26644.97 |
| 1253.0 | 26991.37 |
| 1254.0 | 26940.21 |
| 1255.0 | 26860.26 |
| 1256.0 | 26810.26 |
| 1257.0 | 26917.81 |
| 1258.0 | 26877.81 |
| 1259.0 | 26802.91 |
| 1260.0 | 26792.91 |
| 1261.0 | 26892.21 |
| 1262.0 | 26901.84 |
| 1263.0 | 26951.32 |
| 1264.0 | 27177.32 |
| 1265.0 | 27336.07 |
| 1266.0 | 27268 |
| 1267.0 | 27746.92 |
| 1268.0 | 27704.62 |
| 1269.0 | 27954.22 |
| 1270.0 | 28124.04 |
| 1271.0 | 28063.79 |
| 1272.0 | 28094.79 |
| 1273.0 | 28581.62 |
| 1274.0 | 28563.54 |
| 1275.0 | 28473.79 |
| 1276.0 | 28384.99 |
| 1277.0 | 28446.13 |
| 1278.0 | 28420.13 |
| 1279.0 | 28399.03 |
| 1280.0 | 28313.58 |
| 1281.0 | 28269.2 |
| 1282.0 | 28328.2 |
| 1283.0 | 28227.25 |
| 1284.0 | 28240.5 |
| 1285.0 | 28184.13 |
| 1286.0 | 28200.34 |
| 1287.0 | 28167.54 |
| 1288.0 | 28132.54 |
| 1289.0 | 28149.61 |
| 1290.0 | 28071.61 |
| 1291.0 | 27990.61 |
| 1292.0 | 27880.68 |
| 1293.0 | 27895.1 |
| 1294.0 | 27864.79 |
| 1295.0 | 27854.79 |
| 1296.0 | 27785.79 |
| 1297.0 | 27925.63 |
| 1298.0 | 28379.27 |
| 1299.0 | 28316.27 |
| 1300.0 | 28279.12 |
| 1301.0 | 28185.44 |
| 1302.0 | 28165.44 |
| 1303.0 | 28187.94 |
| 1304.0 | 28125.94 |
| 1305.0 | 28057.94 |
| 1306.0 | 28037.16 |
| 1307.0 | 28047.91 |
| 1308.0 | 27957.07 |
| 1309.0 | 27957.07 |
| 1310.0 | 27917.07 |
| 1311.0 | 28131.36 |
| 1312.0 | 28271.8 |
| 1313.0 | 28320.12 |
| 1314.0 | 28244.34 |
| 1315.0 | 28315.58 |
| 1316.0 | 28315.58 |
| 1317.0 | 28265.58 |
| 1318.0 | 28382.39 |
| 1319.0 | 28302.54 |
| 1320.0 | 28272.14 |
| 1321.0 | 28171.39 |
| 1322.0 | 28247.79 |
| 1323.0 | 28167.79 |
| 1324.0 | 28220.29 |
| 1325.0 | 28210.29 |
| 1326.0 | 28118.99 |
| 1327.0 | 28044.09 |
| 1328.0 | 27934.72 |
| 1329.0 | 27865.32 |
| 1330.0 | 27815.32 |
| 1331.0 | 27757.32 |
| 1332.0 | 27717.32 |
| 1333.0 | 27714.26 |
| 1334.0 | 27782.86 |
| 1335.0 | 27798.06 |
| 1336.0 | 27727.52 |
| 1337.0 | 27667.52 |
| 1338.0 | 27640.52 |
| 1339.0 | 27600.52 |
| 1340.0 | 27668.3 |
| 1341.0 | 27658.3 |
| 1342.0 | 27556.8 |
| 1343.0 | 27479.29 |
| 1344.0 | 27481.85 |
| 1345.0 | 27471.85 |
| 1346.0 | 27410.85 |
| 1347.0 | 27579.75 |
| 1348.0 | 27479.17 |
| 1349.0 | 27511.63 |
| 1350.0 | 27421.88 |
| 1351.0 | 27421.88 |
| 1352.0 | 27360.76 |
| 1353.0 | 27350.76 |
| 1354.0 | 27209.26 |
| 1355.0 | 27262.16 |
| 1356.0 | 27212.16 |
| 1357.0 | 27092.66 |
| 1358.0 | 27092.66 |
| 1359.0 | 27092.66 |
| 1360.0 | 27092.66 |
| 1361.0 | 27041.76 |
| 1362.0 | 27092.01 |
| 1363.0 | 27042.01 |
| 1364.0 | 27024.27 |
| 1365.0 | 26966.27 |
| 1366.0 | 26906.27 |
| 1367.0 | 26808.15 |
| 1368.0 | 26854.65 |
| 1369.0 | 26836.32 |
| 1370.0 | 26790.64 |
| 1371.0 | 26698.14 |
| 1372.0 | 26680.14 |
| 1373.0 | 26886.39 |
| 1374.0 | 26842.39 |
| 1375.0 | 26832.39 |
| 1376.0 | 26825.72 |
| 1377.0 | 26758.22 |
| 1378.0 | 26704.17 |
| 1379.0 | 26704.17 |
| 1380.0 | 26654.17 |
| 1381.0 | 26756.42 |
| 1382.0 | 27215.76 |
| 1383.0 | 27527.71 |
| 1384.0 | 28077.31 |
| 1385.0 | 28020.64 |
| 1386.0 | 27970.64 |
| 1387.0 | 27884.6 |
| 1388.0 | 27909.6 |
| 1389.0 | 27855.6 |
| 1390.0 | 27871.32 |
| 1391.0 | 28132.76 |
| 1392.0 | 28766.34 |
| 1393.0 | 28781.34 |
| 1394.0 | 28701.34 |
| 1395.0 | 28657.34 |
| 1396.0 | 28641.34 |
| 1397.0 | 28603.54 |
| 1398.0 | 28675.13 |
| 1399.0 | 28688.61 |
| 1400.0 | 28635.61 |
| 1401.0 | 28739.99 |
| 1402.0 | 28689.99 |
| 1403.0 | 28699.37 |
| 1404.0 | 28699.37 |
| 1405.0 | 28699.37 |
| 1406.0 | 28699.37 |
| 1407.0 | 28699.37 |
| 1408.0 | 28699.37 |
| 1409.0 | 28699.37 |
| 1410.0 | 28694.21 |
| 1411.0 | 28644.21 |
| 1412.0 | 28669.81 |
| 1413.0 | 28574.06 |
| 1414.0 | 28554.06 |
| 1415.0 | 28518.82 |
| 1416.0 | 28629.52 |
| 1417.0 | 28488.02 |
| 1418.0 | 28571.18 |
| 1419.0 | 28471.28 |
| 1420.0 | 29103.78 |
| 1421.0 | 29101.28 |
| 1422.0 | 29139.66 |
| 1423.0 | 29079.66 |
| 1424.0 | 29047.89 |
| 1425.0 | 29007.89 |
| 1426.0 | 29007.5 |
| 1427.0 | 29108.25 |
| 1428.0 | 29058.25 |
| 1429.0 | 29000.25 |
| 1430.0 | 28981.37 |
| 1431.0 | 29012.37 |
| 1432.0 | 28998.55 |
| 1433.0 | 28988.55 |
| 1434.0 | 28931.81 |
| 1435.0 | 28921.81 |
| 1436.0 | 29119.03 |
| 1437.0 | 29838.24 |
| 1438.0 | 29817.99 |
| 1439.0 | 29759.99 |
| 1440.0 | 29643.49 |
| 1441.0 | 29623.49 |
| 1442.0 | 29573.49 |
| 1443.0 | 29513.49 |
| 1444.0 | 29463.49 |
| 1445.0 | 29463.49 |
| 1446.0 | 29453.49 |
| 1447.0 | 29373.62 |
| 1448.0 | 29263 |
| 1449.0 | 29267.8 |
| 1450.0 | 29203.43 |
| 1451.0 | 29193.43 |
| 1452.0 | 29092.43 |
| 1453.0 | 29056.49 |
| 1454.0 | 29003.69 |
| 1455.0 | 29009.5 |
| 1456.0 | 29009.5 |
| 1457.0 | 29969.43 |
| 1458.0 | 30606.62 |
| 1459.0 | 32060.53 |
| 1460.0 | 32006.53 |
| 1461.0 | 32006.53 |